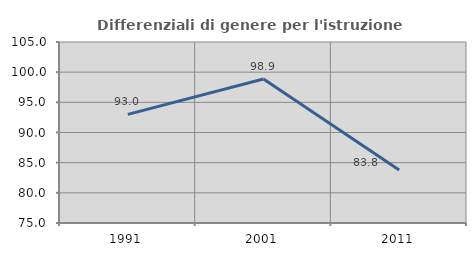
| Category | Differenziali di genere per l'istruzione superiore |
|---|---|
| 1991.0 | 93.012 |
| 2001.0 | 98.88 |
| 2011.0 | 83.788 |